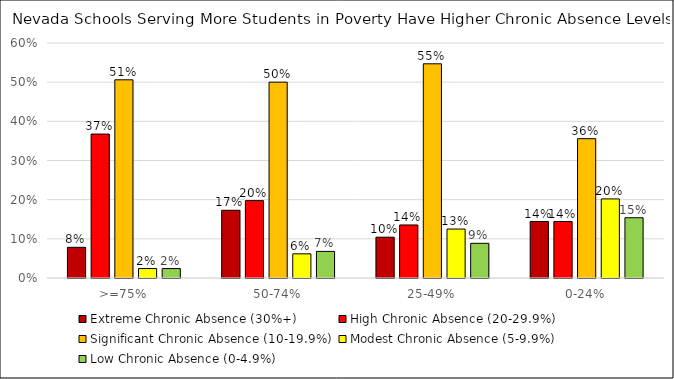
| Category | Extreme Chronic Absence (30%+) | High Chronic Absence (20-29.9%) | Significant Chronic Absence (10-19.9%) | Modest Chronic Absence (5-9.9%) | Low Chronic Absence (0-4.9%) |
|---|---|---|---|---|---|
| >=75% | 0.078 | 0.367 | 0.506 | 0.024 | 0.024 |
| 50-74% | 0.173 | 0.198 | 0.5 | 0.062 | 0.068 |
| 25-49% | 0.104 | 0.135 | 0.547 | 0.125 | 0.089 |
| 0-24% | 0.144 | 0.144 | 0.356 | 0.202 | 0.154 |